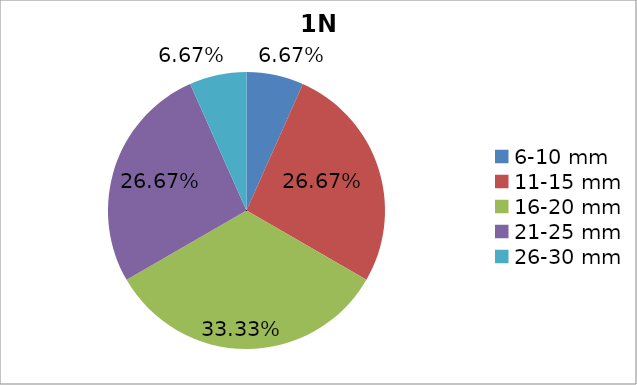
| Category | Series 0 |
|---|---|
| 6-10 mm | 0.067 |
| 11-15 mm | 0.267 |
| 16-20 mm | 0.333 |
| 21-25 mm | 0.267 |
| 26-30 mm | 0.067 |